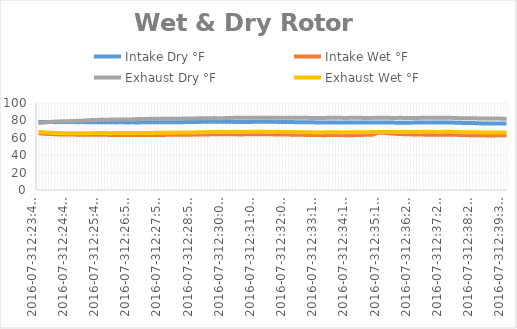
| Category | Intake Dry °F | Intake Wet °F | Exhaust Dry °F | Exhaust Wet °F |
|---|---|---|---|---|
| 2016-07-312:23:40 PM | 78.238 | 65.3 | 77 | 66.762 |
| 2016-07-312:23:47 PM | 78.125 | 64.963 | 77.338 | 66.425 |
| 2016-07-312:23:53 PM | 78.012 | 64.625 | 77.675 | 66.088 |
| 2016-07-312:23:59 PM | 78.125 | 64.4 | 78.012 | 65.975 |
| 2016-07-312:24:06 PM | 78.125 | 64.287 | 78.238 | 65.75 |
| 2016-07-312:24:12 PM | 78.012 | 64.175 | 78.575 | 65.638 |
| 2016-07-312:24:18 PM | 78.012 | 63.95 | 78.688 | 65.525 |
| 2016-07-312:24:25 PM | 78.125 | 63.838 | 78.912 | 65.412 |
| 2016-07-312:24:31 PM | 78.125 | 63.838 | 78.912 | 65.3 |
| 2016-07-312:24:38 PM | 78.125 | 63.725 | 78.912 | 65.3 |
| 2016-07-312:24:44 PM | 78.125 | 63.725 | 79.138 | 65.3 |
| 2016-07-312:24:50 PM | 78.125 | 63.725 | 79.25 | 65.3 |
| 2016-07-312:24:57 PM | 78.012 | 63.612 | 79.475 | 65.3 |
| 2016-07-312:25:03 PM | 78.012 | 63.612 | 79.588 | 65.188 |
| 2016-07-312:25:09 PM | 78.125 | 63.612 | 79.7 | 65.188 |
| 2016-07-312:25:16 PM | 78.012 | 63.612 | 79.925 | 65.188 |
| 2016-07-312:25:22 PM | 78.012 | 63.612 | 80.15 | 65.3 |
| 2016-07-312:25:28 PM | 78.012 | 63.612 | 80.375 | 65.412 |
| 2016-07-312:25:35 PM | 78.012 | 63.612 | 80.488 | 65.412 |
| 2016-07-312:25:41 PM | 77.9 | 63.5 | 80.6 | 65.412 |
| 2016-07-312:25:47 PM | 77.9 | 63.5 | 80.712 | 65.412 |
| 2016-07-312:25:54 PM | 77.9 | 63.388 | 80.825 | 65.412 |
| 2016-07-312:26:00 PM | 77.788 | 63.388 | 80.825 | 65.412 |
| 2016-07-312:26:06 PM | 77.788 | 63.275 | 80.938 | 65.3 |
| 2016-07-312:26:13 PM | 77.788 | 63.275 | 80.938 | 65.412 |
| 2016-07-312:26:19 PM | 77.675 | 63.275 | 81.05 | 65.412 |
| 2016-07-312:26:25 PM | 77.788 | 63.275 | 81.05 | 65.412 |
| 2016-07-312:26:32 PM | 77.788 | 63.275 | 81.05 | 65.412 |
| 2016-07-312:26:38 PM | 77.675 | 63.275 | 81.05 | 65.412 |
| 2016-07-312:26:44 PM | 77.675 | 63.275 | 81.05 | 65.412 |
| 2016-07-312:26:51 PM | 77.788 | 63.162 | 81.162 | 65.412 |
| 2016-07-312:26:57 PM | 77.675 | 63.162 | 81.275 | 65.525 |
| 2016-07-312:27:03 PM | 77.675 | 63.162 | 81.5 | 65.525 |
| 2016-07-312:27:10 PM | 77.788 | 63.162 | 81.613 | 65.638 |
| 2016-07-312:27:16 PM | 77.788 | 63.162 | 81.725 | 65.638 |
| 2016-07-312:27:23 PM | 77.788 | 63.162 | 81.725 | 65.638 |
| 2016-07-312:27:29 PM | 77.788 | 63.162 | 81.838 | 65.525 |
| 2016-07-312:27:35 PM | 77.788 | 63.162 | 81.838 | 65.638 |
| 2016-07-312:27:42 PM | 77.788 | 63.162 | 81.725 | 65.75 |
| 2016-07-312:27:48 PM | 77.9 | 63.162 | 81.838 | 65.863 |
| 2016-07-312:27:54 PM | 77.9 | 63.275 | 81.95 | 65.863 |
| 2016-07-312:28:01 PM | 77.9 | 63.388 | 81.838 | 65.863 |
| 2016-07-312:28:07 PM | 77.9 | 63.388 | 81.95 | 65.975 |
| 2016-07-312:28:13 PM | 77.9 | 63.5 | 81.95 | 65.863 |
| 2016-07-312:28:20 PM | 77.788 | 63.388 | 81.95 | 65.863 |
| 2016-07-312:28:26 PM | 77.788 | 63.388 | 81.95 | 65.863 |
| 2016-07-312:28:32 PM | 77.9 | 63.388 | 82.062 | 66.088 |
| 2016-07-312:28:39 PM | 78.125 | 63.5 | 82.175 | 66.088 |
| 2016-07-312:28:45 PM | 78.125 | 63.5 | 82.288 | 66.2 |
| 2016-07-312:28:51 PM | 78.238 | 63.612 | 82.288 | 66.2 |
| 2016-07-312:28:58 PM | 78.238 | 63.725 | 82.288 | 66.2 |
| 2016-07-312:29:04 PM | 78.238 | 63.612 | 82.4 | 66.312 |
| 2016-07-312:29:10 PM | 78.35 | 63.725 | 82.4 | 66.312 |
| 2016-07-312:29:17 PM | 78.35 | 63.725 | 82.4 | 66.425 |
| 2016-07-312:29:23 PM | 78.462 | 63.838 | 82.512 | 66.538 |
| 2016-07-312:29:30 PM | 78.575 | 63.95 | 82.512 | 66.538 |
| 2016-07-312:29:36 PM | 78.35 | 64.062 | 82.625 | 66.538 |
| 2016-07-312:29:42 PM | 78.462 | 64.062 | 82.625 | 66.538 |
| 2016-07-312:29:49 PM | 78.35 | 64.062 | 82.512 | 66.538 |
| 2016-07-312:29:55 PM | 78.35 | 64.062 | 82.512 | 66.538 |
| 2016-07-312:30:01 PM | 78.35 | 63.95 | 82.625 | 66.538 |
| 2016-07-312:30:08 PM | 78.35 | 63.95 | 82.738 | 66.65 |
| 2016-07-312:30:14 PM | 78.35 | 63.95 | 82.85 | 66.65 |
| 2016-07-312:30:20 PM | 78.125 | 63.95 | 82.962 | 66.65 |
| 2016-07-312:30:27 PM | 78.012 | 63.95 | 82.962 | 66.65 |
| 2016-07-312:30:33 PM | 78.125 | 63.838 | 82.962 | 66.65 |
| 2016-07-312:30:39 PM | 78.125 | 63.95 | 83.075 | 66.762 |
| 2016-07-312:30:46 PM | 78.238 | 64.062 | 82.962 | 66.762 |
| 2016-07-312:30:52 PM | 78.238 | 64.062 | 82.962 | 66.875 |
| 2016-07-312:30:58 PM | 78.35 | 64.062 | 83.075 | 66.988 |
| 2016-07-312:31:05 PM | 78.35 | 64.062 | 83.188 | 66.988 |
| 2016-07-312:31:11 PM | 78.35 | 64.062 | 83.188 | 66.988 |
| 2016-07-312:31:18 PM | 78.35 | 64.062 | 83.075 | 66.875 |
| 2016-07-312:31:24 PM | 78.35 | 64.062 | 83.075 | 66.762 |
| 2016-07-312:31:30 PM | 78.35 | 63.95 | 83.075 | 66.65 |
| 2016-07-312:31:37 PM | 78.35 | 63.95 | 83.075 | 66.65 |
| 2016-07-312:31:43 PM | 78.35 | 63.838 | 83.075 | 66.762 |
| 2016-07-312:31:49 PM | 78.238 | 63.838 | 83.188 | 66.875 |
| 2016-07-312:31:56 PM | 78.238 | 63.838 | 83.188 | 66.762 |
| 2016-07-312:32:02 PM | 78.238 | 63.838 | 83.188 | 66.538 |
| 2016-07-312:32:08 PM | 78.238 | 63.725 | 83.075 | 66.65 |
| 2016-07-312:32:15 PM | 78.125 | 63.612 | 82.962 | 66.538 |
| 2016-07-312:32:21 PM | 78.012 | 63.5 | 82.962 | 66.538 |
| 2016-07-312:32:27 PM | 78.012 | 63.5 | 82.962 | 66.425 |
| 2016-07-312:32:34 PM | 78.012 | 63.388 | 82.962 | 66.538 |
| 2016-07-312:32:40 PM | 77.9 | 63.388 | 82.962 | 66.425 |
| 2016-07-312:32:46 PM | 77.788 | 63.275 | 82.962 | 66.312 |
| 2016-07-312:32:53 PM | 77.788 | 63.275 | 82.85 | 66.312 |
| 2016-07-312:32:59 PM | 77.788 | 63.162 | 82.738 | 66.2 |
| 2016-07-312:33:05 PM | 77.675 | 63.162 | 82.738 | 66.2 |
| 2016-07-312:33:12 PM | 77.675 | 63.162 | 82.738 | 66.2 |
| 2016-07-312:33:18 PM | 77.675 | 63.05 | 82.738 | 66.2 |
| 2016-07-312:33:24 PM | 77.675 | 63.05 | 82.85 | 66.312 |
| 2016-07-312:33:31 PM | 77.675 | 63.275 | 82.962 | 66.425 |
| 2016-07-312:33:37 PM | 77.675 | 63.275 | 82.962 | 66.312 |
| 2016-07-312:33:43 PM | 77.675 | 63.162 | 82.962 | 66.312 |
| 2016-07-312:33:50 PM | 77.562 | 63.162 | 82.962 | 66.312 |
| 2016-07-312:33:56 PM | 77.45 | 63.162 | 82.962 | 66.2 |
| 2016-07-312:34:02 PM | 77.45 | 63.05 | 82.85 | 66.2 |
| 2016-07-312:34:09 PM | 77.45 | 63.05 | 82.85 | 66.312 |
| 2016-07-312:34:15 PM | 77.562 | 63.05 | 82.962 | 66.425 |
| 2016-07-312:34:21 PM | 77.562 | 63.05 | 82.962 | 66.425 |
| 2016-07-312:34:28 PM | 77.675 | 63.162 | 82.962 | 66.312 |
| 2016-07-312:34:34 PM | 77.675 | 63.275 | 82.962 | 66.312 |
| 2016-07-312:34:40 PM | 77.675 | 63.388 | 82.85 | 66.312 |
| 2016-07-312:34:47 PM | 77.675 | 63.388 | 82.85 | 66.312 |
| 2016-07-312:34:53 PM | 77.675 | 63.388 | 82.85 | 66.425 |
| 2016-07-312:34:59 PM | 77.562 | 63.388 | 82.85 | 66.538 |
| 2016-07-312:35:06 PM | 77.45 | 64.85 | 82.962 | 66.538 |
| 2016-07-312:35:12 PM | 77.45 | 65.863 | 82.962 | 66.538 |
| 2016-07-312:35:18 PM | 77.45 | 65.863 | 82.962 | 66.538 |
| 2016-07-312:35:25 PM | 77.562 | 65.638 | 82.962 | 66.538 |
| 2016-07-312:35:31 PM | 77.562 | 65.3 | 82.962 | 66.538 |
| 2016-07-312:35:38 PM | 77.45 | 64.963 | 82.85 | 66.538 |
| 2016-07-312:35:44 PM | 77.45 | 64.738 | 82.85 | 66.538 |
| 2016-07-312:35:50 PM | 77.338 | 64.4 | 82.85 | 66.65 |
| 2016-07-312:35:57 PM | 77.45 | 64.287 | 82.962 | 66.65 |
| 2016-07-312:36:03 PM | 77.338 | 64.175 | 82.85 | 66.65 |
| 2016-07-312:36:09 PM | 77.338 | 64.062 | 82.85 | 66.538 |
| 2016-07-312:36:16 PM | 77.338 | 63.95 | 82.85 | 66.538 |
| 2016-07-312:36:22 PM | 77.45 | 63.838 | 82.738 | 66.538 |
| 2016-07-312:36:28 PM | 77.45 | 63.725 | 82.738 | 66.65 |
| 2016-07-312:36:35 PM | 77.562 | 63.725 | 82.85 | 66.65 |
| 2016-07-312:36:41 PM | 77.562 | 63.725 | 82.962 | 66.762 |
| 2016-07-312:36:47 PM | 77.562 | 63.612 | 83.075 | 66.875 |
| 2016-07-312:36:54 PM | 77.675 | 63.612 | 83.075 | 66.875 |
| 2016-07-312:37:00 PM | 77.675 | 63.612 | 83.188 | 66.875 |
| 2016-07-312:37:06 PM | 77.675 | 63.612 | 83.188 | 66.762 |
| 2016-07-312:37:13 PM | 77.675 | 63.612 | 83.075 | 66.762 |
| 2016-07-312:37:19 PM | 77.562 | 63.5 | 83.075 | 66.762 |
| 2016-07-312:37:25 PM | 77.562 | 63.5 | 83.075 | 66.988 |
| 2016-07-312:37:32 PM | 77.562 | 63.5 | 83.075 | 66.988 |
| 2016-07-312:37:38 PM | 77.562 | 63.388 | 83.075 | 66.875 |
| 2016-07-312:37:45 PM | 77.45 | 63.388 | 82.85 | 66.762 |
| 2016-07-312:37:51 PM | 77.338 | 63.388 | 82.738 | 66.65 |
| 2016-07-312:37:57 PM | 77.225 | 63.275 | 82.512 | 66.538 |
| 2016-07-312:38:04 PM | 77.113 | 63.162 | 82.4 | 66.425 |
| 2016-07-312:38:10 PM | 77.113 | 63.162 | 82.4 | 66.425 |
| 2016-07-312:38:16 PM | 77 | 63.05 | 82.4 | 66.425 |
| 2016-07-312:38:23 PM | 77 | 62.938 | 82.4 | 66.425 |
| 2016-07-312:38:29 PM | 76.888 | 62.938 | 82.4 | 66.312 |
| 2016-07-312:38:35 PM | 76.662 | 62.938 | 82.288 | 66.312 |
| 2016-07-312:38:42 PM | 76.55 | 62.938 | 82.175 | 66.2 |
| 2016-07-312:38:48 PM | 76.438 | 62.825 | 82.062 | 66.088 |
| 2016-07-312:38:54 PM | 76.438 | 62.713 | 82.062 | 66.088 |
| 2016-07-312:39:01 PM | 76.438 | 62.713 | 82.062 | 66.088 |
| 2016-07-312:39:07 PM | 76.438 | 62.713 | 82.062 | 66.2 |
| 2016-07-312:39:13 PM | 76.438 | 62.825 | 82.062 | 66.2 |
| 2016-07-312:39:20 PM | 76.438 | 62.825 | 82.062 | 66.2 |
| 2016-07-312:39:26 PM | 76.438 | 62.938 | 81.95 | 66.2 |
| 2016-07-312:39:32 PM | 76.438 | 62.938 | 81.95 | 66.088 |